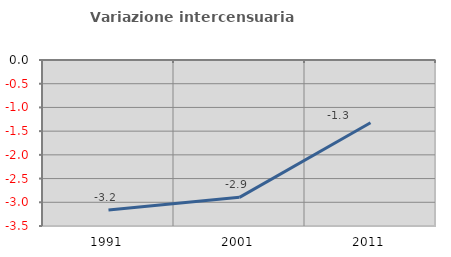
| Category | Variazione intercensuaria annua |
|---|---|
| 1991.0 | -3.164 |
| 2001.0 | -2.896 |
| 2011.0 | -1.323 |